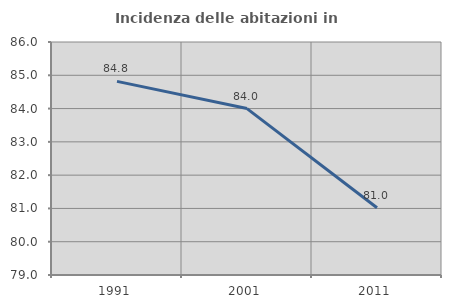
| Category | Incidenza delle abitazioni in proprietà  |
|---|---|
| 1991.0 | 84.817 |
| 2001.0 | 84 |
| 2011.0 | 81.019 |